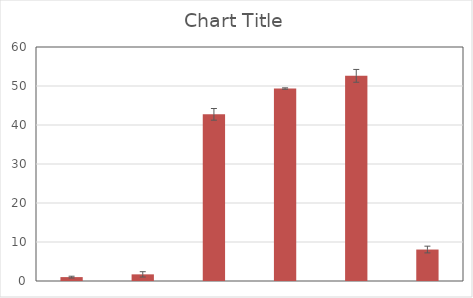
| Category | Series 1 |
|---|---|
| 0 | 1 |
| 1 | 1.705 |
| 2 | 42.732 |
| 3 | 49.349 |
| 4 | 52.605 |
| 5 | 8.068 |